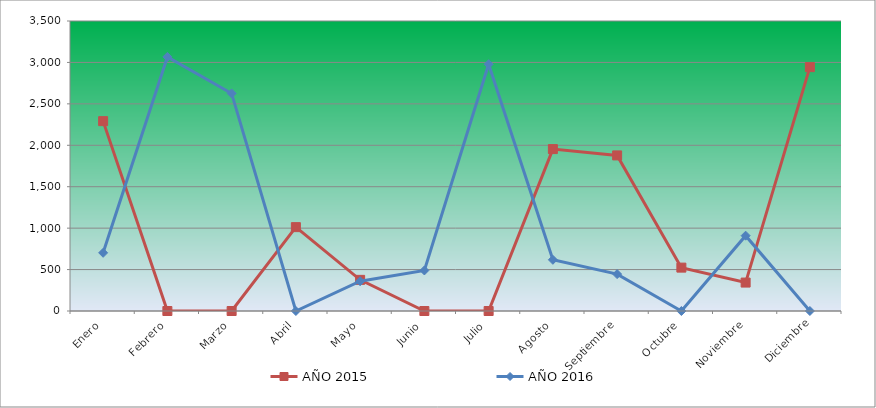
| Category | AÑO 2015 | AÑO 2016 |
|---|---|---|
| Enero | 2291.56 | 702.098 |
| Febrero | 0 | 3066.596 |
| Marzo | 0 | 2625.989 |
| Abril | 1012.106 | 0 |
| Mayo | 375.918 | 359.388 |
| Junio | 0 | 489.272 |
| Julio | 0 | 2977.899 |
| Agosto | 1954.191 | 617.895 |
| Septiembre | 1877.806 | 445.136 |
| Octubre | 523.509 | 0 |
| Noviembre | 343.119 | 909.188 |
| Diciembre | 2943.192 | 0 |